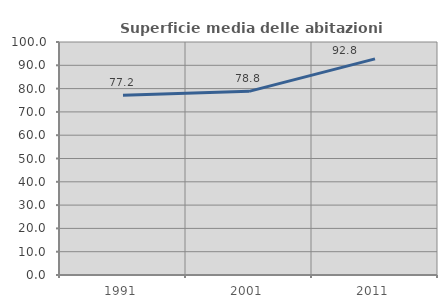
| Category | Superficie media delle abitazioni occupate |
|---|---|
| 1991.0 | 77.166 |
| 2001.0 | 78.81 |
| 2011.0 | 92.761 |